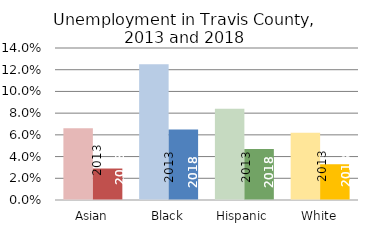
| Category | 2009-2013 | 2014-2018 |
|---|---|---|
| Asian | 0.066 | 0.029 |
| Black | 0.125 | 0.065 |
| Hispanic | 0.084 | 0.047 |
| White | 0.062 | 0.033 |